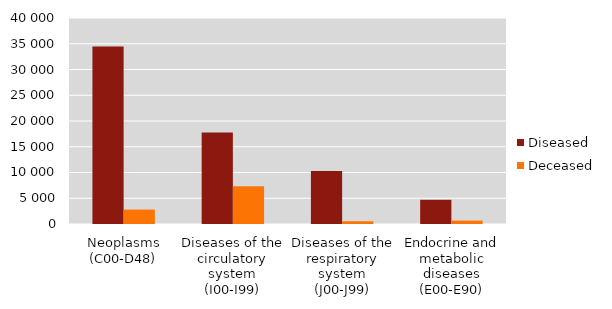
| Category | Diseased | Deceased |
|---|---|---|
| Neoplasms (C00-D48) | 34482 | 2802 |
| Diseases of the circulatory system (I00-I99) | 17756 | 7339 |
| Diseases of the respiratory system (J00-J99) | 10313 | 536 |
| Endocrine and metabolic diseases (E00-E90) | 4698 | 654 |